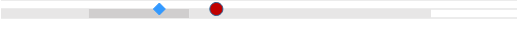
| Category | left | mid start | mid end | right |
|---|---|---|---|---|
| 0 | 0 | 0.205 | 0.233 | 0.562 |